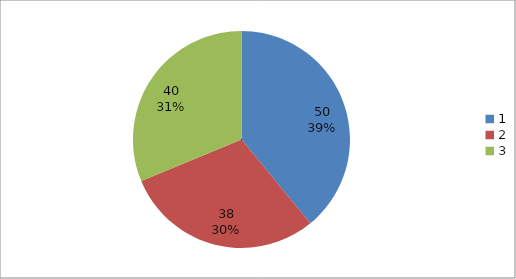
| Category | Series 0 |
|---|---|
| 0 | 50 |
| 1 | 38 |
| 2 | 40 |